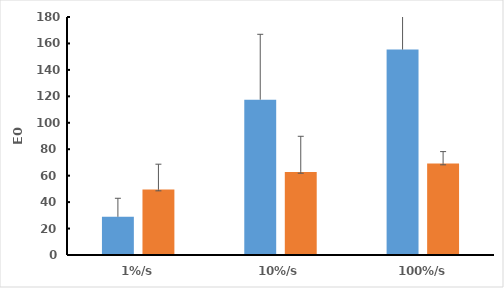
| Category | Native | Decellularised |
|---|---|---|
| 1%/s | 28.877 | 49.526 |
| 10%/s | 117.477 | 62.85 |
| 100%/s | 155.361 | 69.199 |